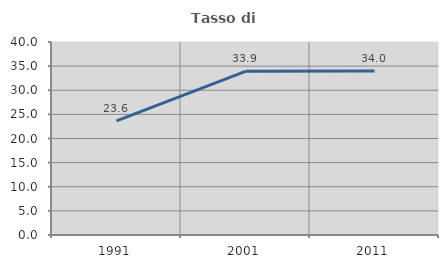
| Category | Tasso di occupazione   |
|---|---|
| 1991.0 | 23.642 |
| 2001.0 | 33.924 |
| 2011.0 | 33.965 |